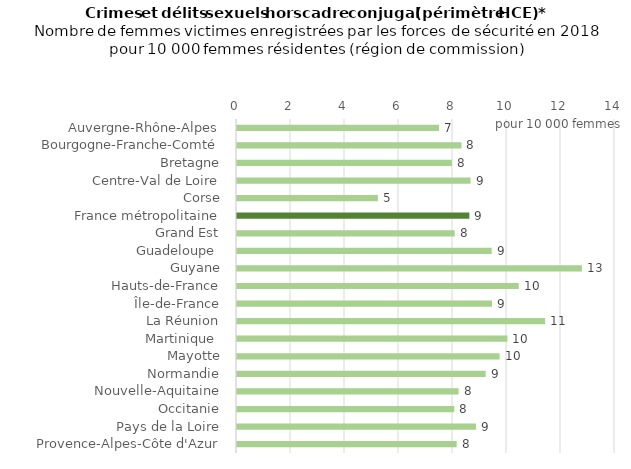
| Category | Series 0 |
|---|---|
| Auvergne-Rhône-Alpes | 7.48 |
| Bourgogne-Franche-Comté | 8.314 |
| Bretagne | 7.959 |
| Centre-Val de Loire | 8.649 |
| Corse | 5.218 |
| France métropolitaine | 8.606 |
| Grand Est | 8.062 |
| Guadeloupe  | 9.433 |
| Guyane | 12.773 |
| Hauts-de-France | 10.436 |
| Île-de-France | 9.444 |
| La Réunion | 11.414 |
| Martinique  | 10.018 |
| Mayotte | 9.727 |
| Normandie | 9.21 |
| Nouvelle-Aquitaine | 8.206 |
| Occitanie | 8.047 |
| Pays de la Loire | 8.855 |
| Provence-Alpes-Côte d'Azur | 8.135 |